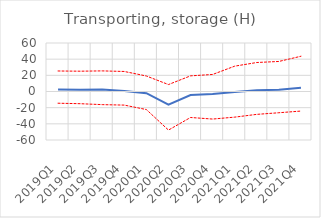
| Category | p25 | Median | p75 | Zero line |
|---|---|---|---|---|
| 2019Q1 | -14.498 | 2.627 | 25.377 | 0 |
| 2019Q2 | -15.088 | 2.169 | 25.12 | 0 |
| 2019Q3 | -16.252 | 2.326 | 25.491 | 0 |
| 2019Q4 | -16.827 | 0.687 | 24.785 | 0 |
| 2020Q1 | -22.352 | -2.085 | 19.165 | 0 |
| 2020Q2 | -47.733 | -16.328 | 8.6 | 0 |
| 2020Q3 | -32.146 | -4.334 | 19.357 | 0 |
| 2020Q4 | -34.089 | -3.115 | 21.066 | 0 |
| 2021Q1 | -31.713 | -0.705 | 31.352 | 0 |
| 2021Q2 | -28.285 | 1.444 | 35.867 | 0 |
| 2021Q3 | -26.281 | 2.097 | 37.168 | 0 |
| 2021Q4 | -24.206 | 4.708 | 43.622 | 0 |